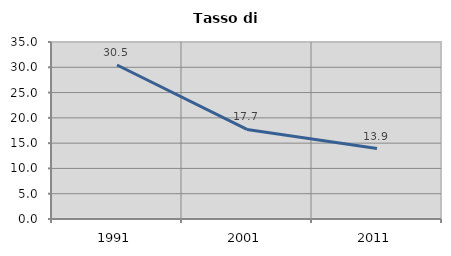
| Category | Tasso di disoccupazione   |
|---|---|
| 1991.0 | 30.45 |
| 2001.0 | 17.706 |
| 2011.0 | 13.921 |